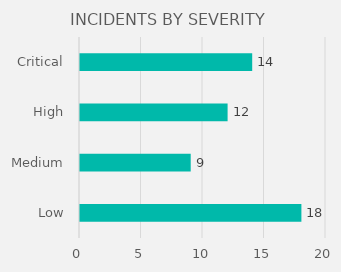
| Category | INCIDENTS BY SEVERITY |
|---|---|
| Low | 18 |
| Medium | 9 |
| High | 12 |
| Critical | 14 |